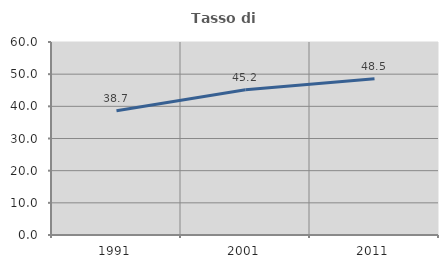
| Category | Tasso di occupazione   |
|---|---|
| 1991.0 | 38.652 |
| 2001.0 | 45.181 |
| 2011.0 | 48.543 |